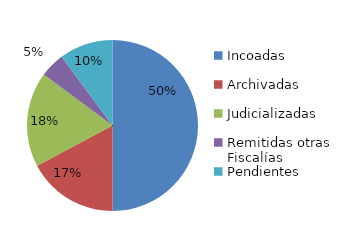
| Category | Series 0 |
|---|---|
| Incoadas | 64 |
| Archivadas | 22 |
| Judicializadas | 23 |
| Remitidas otras Fiscalías | 6 |
| Pendientes | 13 |